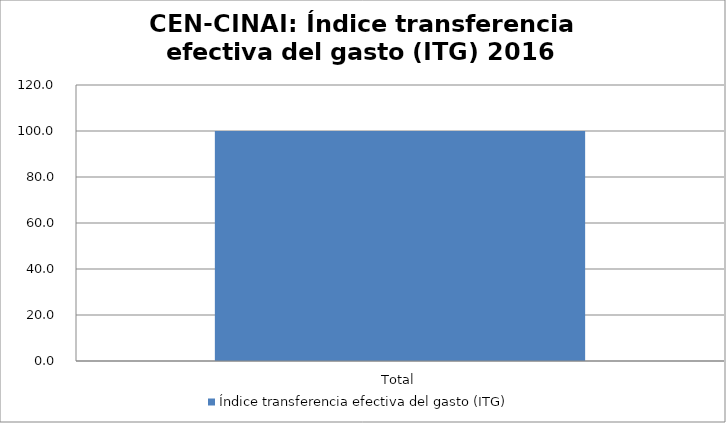
| Category | Índice transferencia efectiva del gasto (ITG) |
|---|---|
| Total | 100 |